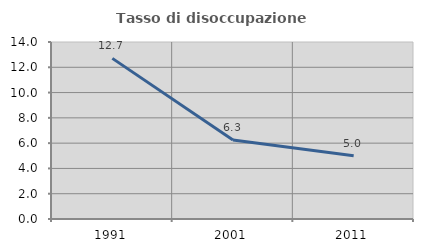
| Category | Tasso di disoccupazione giovanile  |
|---|---|
| 1991.0 | 12.705 |
| 2001.0 | 6.25 |
| 2011.0 | 5 |